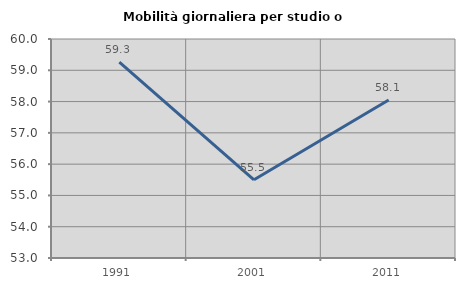
| Category | Mobilità giornaliera per studio o lavoro |
|---|---|
| 1991.0 | 59.26 |
| 2001.0 | 55.5 |
| 2011.0 | 58.052 |